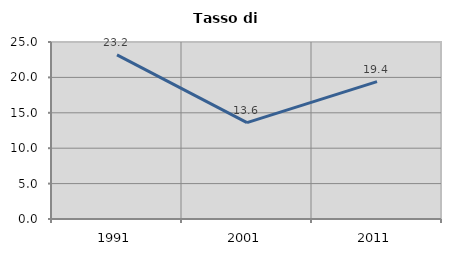
| Category | Tasso di disoccupazione   |
|---|---|
| 1991.0 | 23.19 |
| 2001.0 | 13.607 |
| 2011.0 | 19.394 |